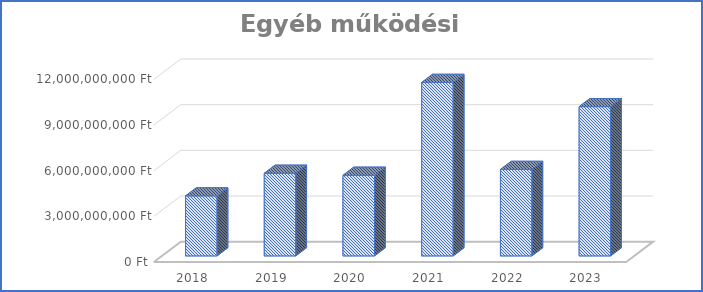
| Category | Egyéb működési kiadások |
|---|---|
| 2018.0 | 3942625601 |
| 2019.0 | 5428881702 |
| 2020.0 | 5297068193 |
| 2021.0 | 11399034498 |
| 2022.0 | 5681443890 |
| 2023.0 | 9806710864 |